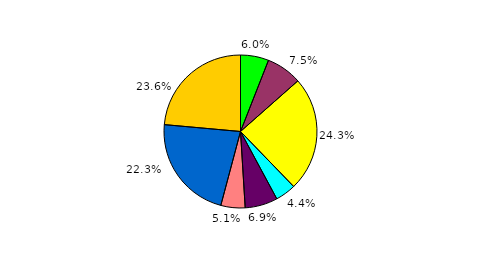
| Category | Series 0 |
|---|---|
| 0 | 5.962 |
| 1 | 7.532 |
| 2 | 24.274 |
| 3 | 4.357 |
| 4 | 6.895 |
| 5 | 5.124 |
| 6 | 22.29 |
| 7 | 23.566 |